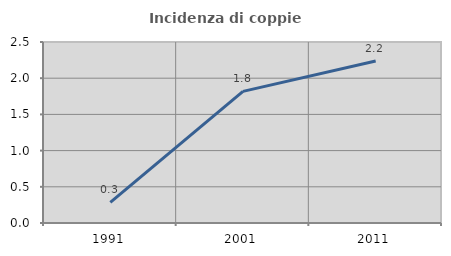
| Category | Incidenza di coppie miste |
|---|---|
| 1991.0 | 0.284 |
| 2001.0 | 1.818 |
| 2011.0 | 2.238 |